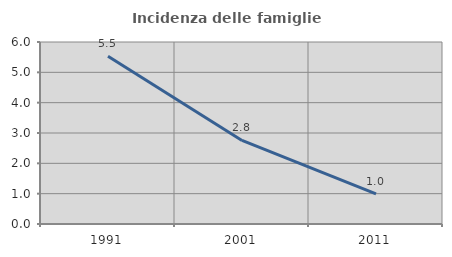
| Category | Incidenza delle famiglie numerose |
|---|---|
| 1991.0 | 5.53 |
| 2001.0 | 2.756 |
| 2011.0 | 0.996 |